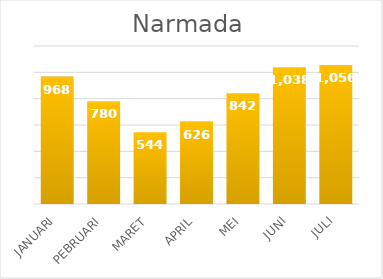
| Category |  968  |
|---|---|
| JANUARI | 968 |
| PEBRUARI | 780 |
| MARET | 544 |
| APRIL | 626 |
| MEI | 842 |
| JUNI | 1038 |
| JULI | 1056 |